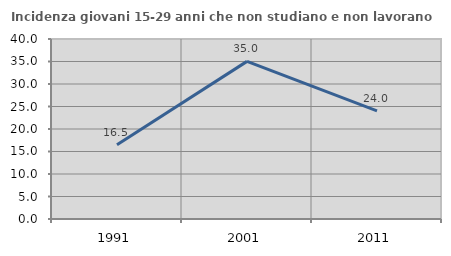
| Category | Incidenza giovani 15-29 anni che non studiano e non lavorano  |
|---|---|
| 1991.0 | 16.514 |
| 2001.0 | 35.027 |
| 2011.0 | 24.032 |